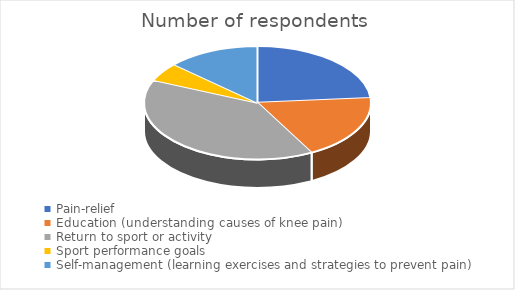
| Category | Number of respondents  | Percentage  |
|---|---|---|
| Pain-relief   | 9 | 0.29 |
| Education (understanding causes of knee pain)  | 7 | 0.226 |
| Return to sport or activity  | 15 | 0.484 |
| Sport performance goals  | 2 | 0.065 |
| Self-management (learning exercises and strategies to prevent pain)  | 5 | 0.161 |